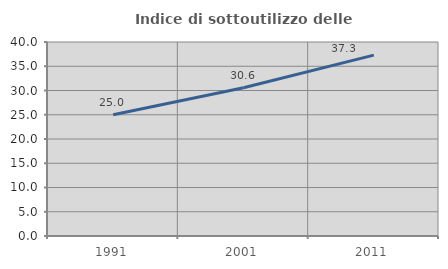
| Category | Indice di sottoutilizzo delle abitazioni  |
|---|---|
| 1991.0 | 25 |
| 2001.0 | 30.556 |
| 2011.0 | 37.302 |